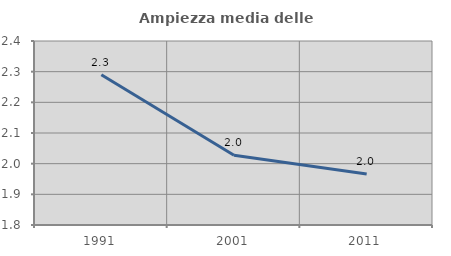
| Category | Ampiezza media delle famiglie |
|---|---|
| 1991.0 | 2.29 |
| 2001.0 | 2.028 |
| 2011.0 | 1.967 |